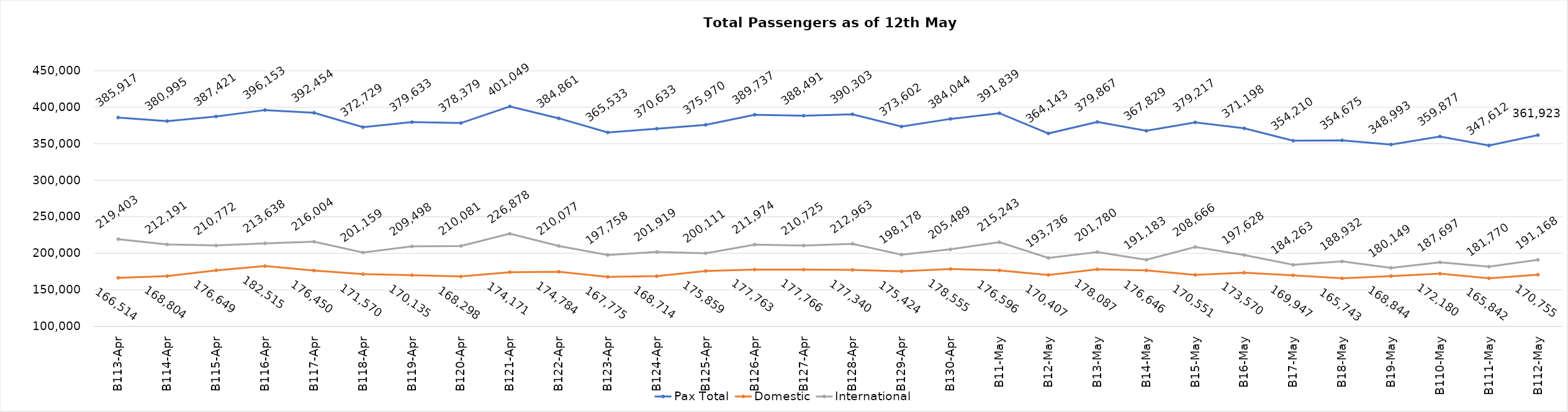
| Category | Pax Total | Domestic | International |
|---|---|---|---|
| 2024-04-13 | 385917 | 166514 | 219403 |
| 2024-04-14 | 380995 | 168804 | 212191 |
| 2024-04-15 | 387421 | 176649 | 210772 |
| 2024-04-16 | 396153 | 182515 | 213638 |
| 2024-04-17 | 392454 | 176450 | 216004 |
| 2024-04-18 | 372729 | 171570 | 201159 |
| 2024-04-19 | 379633 | 170135 | 209498 |
| 2024-04-20 | 378379 | 168298 | 210081 |
| 2024-04-21 | 401049 | 174171 | 226878 |
| 2024-04-22 | 384861 | 174784 | 210077 |
| 2024-04-23 | 365533 | 167775 | 197758 |
| 2024-04-24 | 370633 | 168714 | 201919 |
| 2024-04-25 | 375970 | 175859 | 200111 |
| 2024-04-26 | 389737 | 177763 | 211974 |
| 2024-04-27 | 388491 | 177766 | 210725 |
| 2024-04-28 | 390303 | 177340 | 212963 |
| 2024-04-29 | 373602 | 175424 | 198178 |
| 2024-04-30 | 384044 | 178555 | 205489 |
| 2024-05-01 | 391839 | 176596 | 215243 |
| 2024-05-02 | 364143 | 170407 | 193736 |
| 2024-05-03 | 379867 | 178087 | 201780 |
| 2024-05-04 | 367829 | 176646 | 191183 |
| 2024-05-05 | 379217 | 170551 | 208666 |
| 2024-05-06 | 371198 | 173570 | 197628 |
| 2024-05-07 | 354210 | 169947 | 184263 |
| 2024-05-08 | 354675 | 165743 | 188932 |
| 2024-05-09 | 348993 | 168844 | 180149 |
| 2024-05-10 | 359877 | 172180 | 187697 |
| 2024-05-11 | 347612 | 165842 | 181770 |
| 2024-05-12 | 361923 | 170755 | 191168 |